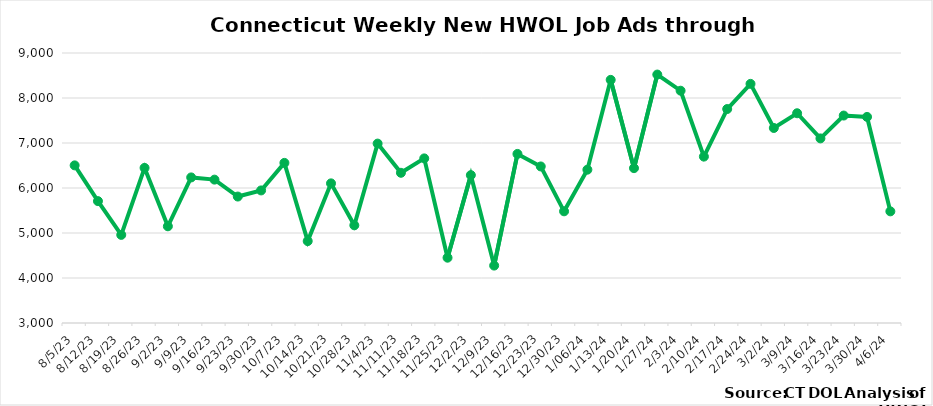
| Category | Connecticut |
|---|---|
| 8/5/23 | 6503 |
| 8/12/23 | 5708 |
| 8/19/23 | 4958 |
| 8/26/23 | 6447 |
| 9/2/23 | 5149 |
| 9/9/23 | 6235 |
| 9/16/23 | 6186 |
| 9/23/23 | 5810 |
| 9/30/23 | 5946 |
| 10/7/23 | 6558 |
| 10/14/23 | 4820 |
| 10/21/23 | 6103 |
| 10/28/23 | 5171 |
| 11/4/23 | 6987 |
| 11/11/23 | 6338 |
| 11/18/23 | 6658 |
| 11/25/23 | 4451 |
| 12/2/23 | 6286 |
| 12/9/23 | 4276 |
| 12/16/23 | 6757 |
|  12/23/23 | 6479 |
|  12/30/23 | 5482 |
|  1/06/24 | 6407 |
|  1/13/24 | 8403 |
|  1/20/24 | 6441 |
|  1/27/24 | 8521 |
|  2/3/24 | 8162 |
|  2/10/24 | 6698 |
|  2/17/24 | 7755 |
|  2/24/24 | 8314 |
|  3/2/24 | 7334 |
|  3/9/24 | 7661 |
|  3/16/24 | 7102 |
|  3/23/24 | 7610 |
|  3/30/24 | 7580 |
|  4/6/24 | 5481 |